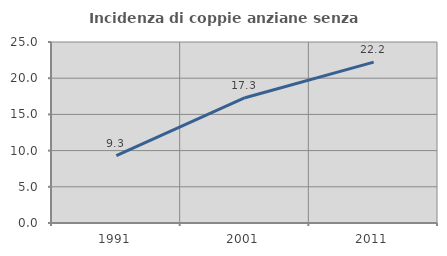
| Category | Incidenza di coppie anziane senza figli  |
|---|---|
| 1991.0 | 9.322 |
| 2001.0 | 17.308 |
| 2011.0 | 22.222 |